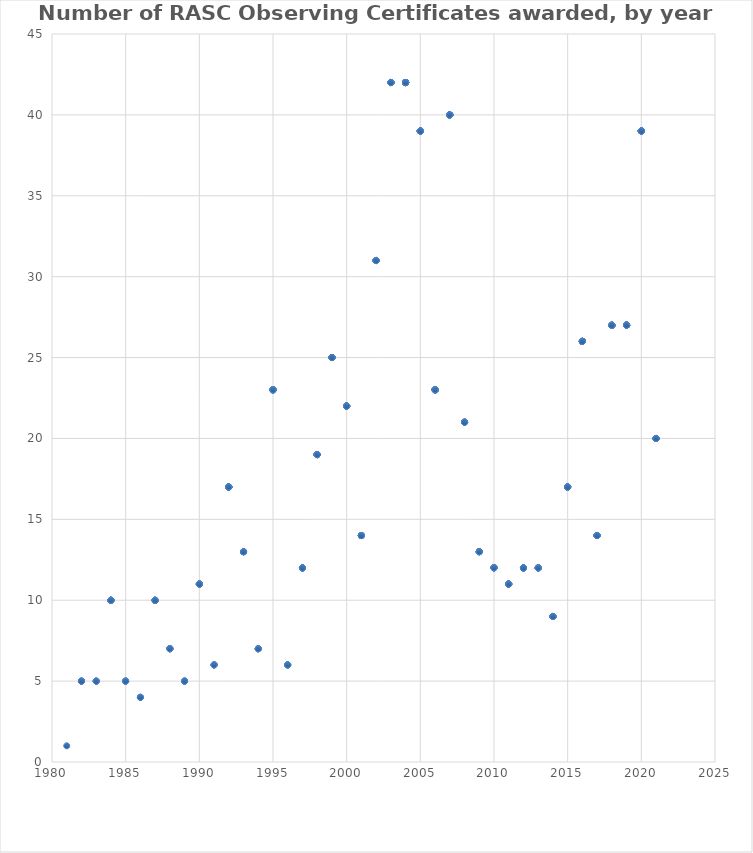
| Category | Series 0 |
|---|---|
| 2021.0 | 20 |
| 2021.0 | 20 |
| 2021.0 | 20 |
| 2021.0 | 20 |
| 2021.0 | 20 |
| 2021.0 | 20 |
| 2021.0 | 20 |
| 2021.0 | 20 |
| 2021.0 | 20 |
| 2021.0 | 20 |
| 2021.0 | 20 |
| 2021.0 | 20 |
| 2021.0 | 20 |
| 2021.0 | 20 |
| 2021.0 | 20 |
| 2021.0 | 20 |
| 2021.0 | 20 |
| 2021.0 | 20 |
| 2021.0 | 20 |
| 2021.0 | 20 |
| 2020.0 | 39 |
| 2020.0 | 39 |
| 2020.0 | 39 |
| 2020.0 | 39 |
| 2020.0 | 39 |
| 2020.0 | 39 |
| 2020.0 | 39 |
| 2020.0 | 39 |
| 2020.0 | 39 |
| 2020.0 | 39 |
| 2020.0 | 39 |
| 2020.0 | 39 |
| 2020.0 | 39 |
| 2020.0 | 39 |
| 2020.0 | 39 |
| 2020.0 | 39 |
| 2020.0 | 39 |
| 2020.0 | 39 |
| 2020.0 | 39 |
| 2020.0 | 39 |
| 2020.0 | 39 |
| 2020.0 | 39 |
| 2020.0 | 39 |
| 2020.0 | 39 |
| 2020.0 | 39 |
| 2020.0 | 39 |
| 2020.0 | 39 |
| 2020.0 | 39 |
| 2020.0 | 39 |
| 2020.0 | 39 |
| 2020.0 | 39 |
| 2020.0 | 39 |
| 2020.0 | 39 |
| 2020.0 | 39 |
| 2020.0 | 39 |
| 2020.0 | 39 |
| 2020.0 | 39 |
| 2020.0 | 39 |
| 2020.0 | 39 |
| 2019.0 | 27 |
| 2019.0 | 27 |
| 2019.0 | 27 |
| 2019.0 | 27 |
| 2019.0 | 27 |
| 2019.0 | 27 |
| 2019.0 | 27 |
| 2019.0 | 27 |
| 2019.0 | 27 |
| 2019.0 | 27 |
| 2019.0 | 27 |
| 2019.0 | 27 |
| 2019.0 | 27 |
| 2019.0 | 27 |
| 2019.0 | 27 |
| 2019.0 | 27 |
| 2019.0 | 27 |
| 2019.0 | 27 |
| 2019.0 | 27 |
| 2019.0 | 27 |
| 2019.0 | 27 |
| 2019.0 | 27 |
| 2019.0 | 27 |
| 2019.0 | 27 |
| 2019.0 | 27 |
| 2019.0 | 27 |
| 2019.0 | 27 |
| 2018.0 | 27 |
| 2018.0 | 27 |
| 2018.0 | 27 |
| 2018.0 | 27 |
| 2018.0 | 27 |
| 2018.0 | 27 |
| 2018.0 | 27 |
| 2018.0 | 27 |
| 2018.0 | 27 |
| 2018.0 | 27 |
| 2018.0 | 27 |
| 2018.0 | 27 |
| 2018.0 | 27 |
| 2018.0 | 27 |
| 2018.0 | 27 |
| 2018.0 | 27 |
| 2018.0 | 27 |
| 2018.0 | 27 |
| 2018.0 | 27 |
| 2018.0 | 27 |
| 2018.0 | 27 |
| 2018.0 | 27 |
| 2018.0 | 27 |
| 2018.0 | 27 |
| 2018.0 | 27 |
| 2018.0 | 27 |
| 2018.0 | 27 |
| 2017.0 | 14 |
| 2017.0 | 14 |
| 2017.0 | 14 |
| 2017.0 | 14 |
| 2017.0 | 14 |
| 2017.0 | 14 |
| 2017.0 | 14 |
| 2017.0 | 14 |
| 2017.0 | 14 |
| 2017.0 | 14 |
| 2017.0 | 14 |
| 2017.0 | 14 |
| 2017.0 | 14 |
| 2017.0 | 14 |
| 2016.0 | 26 |
| 2016.0 | 26 |
| 2016.0 | 26 |
| 2016.0 | 26 |
| 2016.0 | 26 |
| 2016.0 | 26 |
| 2016.0 | 26 |
| 2016.0 | 26 |
| 2016.0 | 26 |
| 2016.0 | 26 |
| 2016.0 | 26 |
| 2016.0 | 26 |
| 2016.0 | 26 |
| 2016.0 | 26 |
| 2016.0 | 26 |
| 2016.0 | 26 |
| 2016.0 | 26 |
| 2016.0 | 26 |
| 2016.0 | 26 |
| 2016.0 | 26 |
| 2016.0 | 26 |
| 2016.0 | 26 |
| 2016.0 | 26 |
| 2016.0 | 26 |
| 2016.0 | 26 |
| 2016.0 | 26 |
| 2015.0 | 17 |
| 2015.0 | 17 |
| 2015.0 | 17 |
| 2015.0 | 17 |
| 2015.0 | 17 |
| 2015.0 | 17 |
| 2015.0 | 17 |
| 2015.0 | 17 |
| 2015.0 | 17 |
| 2015.0 | 17 |
| 2015.0 | 17 |
| 2015.0 | 17 |
| 2015.0 | 17 |
| 2015.0 | 17 |
| 2015.0 | 17 |
| 2015.0 | 17 |
| 2015.0 | 17 |
| 2014.0 | 9 |
| 2014.0 | 9 |
| 2014.0 | 9 |
| 2014.0 | 9 |
| 2014.0 | 9 |
| 2014.0 | 9 |
| 2014.0 | 9 |
| 2014.0 | 9 |
| 2014.0 | 9 |
| 2013.0 | 12 |
| 2013.0 | 12 |
| 2013.0 | 12 |
| 2013.0 | 12 |
| 2013.0 | 12 |
| 2013.0 | 12 |
| 2013.0 | 12 |
| 2013.0 | 12 |
| 2013.0 | 12 |
| 2013.0 | 12 |
| 2013.0 | 12 |
| 2013.0 | 12 |
| 2012.0 | 12 |
| 2012.0 | 12 |
| 2012.0 | 12 |
| 2012.0 | 12 |
| 2012.0 | 12 |
| 2012.0 | 12 |
| 2012.0 | 12 |
| 2012.0 | 12 |
| 2012.0 | 12 |
| 2012.0 | 12 |
| 2012.0 | 12 |
| 2012.0 | 12 |
| 2011.0 | 11 |
| 2011.0 | 11 |
| 2011.0 | 11 |
| 2011.0 | 11 |
| 2011.0 | 11 |
| 2011.0 | 11 |
| 2011.0 | 11 |
| 2011.0 | 11 |
| 2011.0 | 11 |
| 2011.0 | 11 |
| 2011.0 | 11 |
| 2010.0 | 12 |
| 2010.0 | 12 |
| 2010.0 | 12 |
| 2010.0 | 12 |
| 2010.0 | 12 |
| 2010.0 | 12 |
| 2010.0 | 12 |
| 2010.0 | 12 |
| 2010.0 | 12 |
| 2010.0 | 12 |
| 2010.0 | 12 |
| 2010.0 | 12 |
| 2009.0 | 13 |
| 2009.0 | 13 |
| 2009.0 | 13 |
| 2009.0 | 13 |
| 2009.0 | 13 |
| 2009.0 | 13 |
| 2009.0 | 13 |
| 2009.0 | 13 |
| 2009.0 | 13 |
| 2009.0 | 13 |
| 2009.0 | 13 |
| 2009.0 | 13 |
| 2009.0 | 13 |
| 2008.0 | 21 |
| 2008.0 | 21 |
| 2008.0 | 21 |
| 2008.0 | 21 |
| 2008.0 | 21 |
| 2008.0 | 21 |
| 2008.0 | 21 |
| 2008.0 | 21 |
| 2008.0 | 21 |
| 2008.0 | 21 |
| 2008.0 | 21 |
| 2008.0 | 21 |
| 2008.0 | 21 |
| 2008.0 | 21 |
| 2008.0 | 21 |
| 2008.0 | 21 |
| 2008.0 | 21 |
| 2008.0 | 21 |
| 2008.0 | 21 |
| 2008.0 | 21 |
| 2008.0 | 21 |
| 2007.0 | 40 |
| 2007.0 | 40 |
| 2007.0 | 40 |
| 2007.0 | 40 |
| 2007.0 | 40 |
| 2007.0 | 40 |
| 2007.0 | 40 |
| 2007.0 | 40 |
| 2007.0 | 40 |
| 2007.0 | 40 |
| 2007.0 | 40 |
| 2007.0 | 40 |
| 2007.0 | 40 |
| 2007.0 | 40 |
| 2007.0 | 40 |
| 2007.0 | 40 |
| 2007.0 | 40 |
| 2007.0 | 40 |
| 2007.0 | 40 |
| 2007.0 | 40 |
| 2007.0 | 40 |
| 2007.0 | 40 |
| 2007.0 | 40 |
| 2007.0 | 40 |
| 2007.0 | 40 |
| 2007.0 | 40 |
| 2007.0 | 40 |
| 2007.0 | 40 |
| 2007.0 | 40 |
| 2007.0 | 40 |
| 2007.0 | 40 |
| 2007.0 | 40 |
| 2007.0 | 40 |
| 2007.0 | 40 |
| 2007.0 | 40 |
| 2007.0 | 40 |
| 2007.0 | 40 |
| 2007.0 | 40 |
| 2007.0 | 40 |
| 2007.0 | 40 |
| 2006.0 | 23 |
| 2006.0 | 23 |
| 2006.0 | 23 |
| 2006.0 | 23 |
| 2006.0 | 23 |
| 2006.0 | 23 |
| 2006.0 | 23 |
| 2006.0 | 23 |
| 2006.0 | 23 |
| 2006.0 | 23 |
| 2006.0 | 23 |
| 2006.0 | 23 |
| 2006.0 | 23 |
| 2006.0 | 23 |
| 2006.0 | 23 |
| 2006.0 | 23 |
| 2006.0 | 23 |
| 2006.0 | 23 |
| 2006.0 | 23 |
| 2006.0 | 23 |
| 2006.0 | 23 |
| 2006.0 | 23 |
| 2006.0 | 23 |
| 2005.0 | 39 |
| 2005.0 | 39 |
| 2005.0 | 39 |
| 2005.0 | 39 |
| 2005.0 | 39 |
| 2005.0 | 39 |
| 2005.0 | 39 |
| 2005.0 | 39 |
| 2005.0 | 39 |
| 2005.0 | 39 |
| 2005.0 | 39 |
| 2005.0 | 39 |
| 2005.0 | 39 |
| 2005.0 | 39 |
| 2005.0 | 39 |
| 2005.0 | 39 |
| 2005.0 | 39 |
| 2005.0 | 39 |
| 2005.0 | 39 |
| 2005.0 | 39 |
| 2005.0 | 39 |
| 2005.0 | 39 |
| 2005.0 | 39 |
| 2005.0 | 39 |
| 2005.0 | 39 |
| 2005.0 | 39 |
| 2005.0 | 39 |
| 2005.0 | 39 |
| 2005.0 | 39 |
| 2005.0 | 39 |
| 2005.0 | 39 |
| 2005.0 | 39 |
| 2005.0 | 39 |
| 2005.0 | 39 |
| 2005.0 | 39 |
| 2005.0 | 39 |
| 2005.0 | 39 |
| 2005.0 | 39 |
| 2005.0 | 39 |
| 2004.0 | 42 |
| 2004.0 | 42 |
| 2004.0 | 42 |
| 2004.0 | 42 |
| 2004.0 | 42 |
| 2004.0 | 42 |
| 2004.0 | 42 |
| 2004.0 | 42 |
| 2004.0 | 42 |
| 2004.0 | 42 |
| 2004.0 | 42 |
| 2004.0 | 42 |
| 2004.0 | 42 |
| 2004.0 | 42 |
| 2004.0 | 42 |
| 2004.0 | 42 |
| 2004.0 | 42 |
| 2004.0 | 42 |
| 2004.0 | 42 |
| 2004.0 | 42 |
| 2004.0 | 42 |
| 2004.0 | 42 |
| 2004.0 | 42 |
| 2004.0 | 42 |
| 2004.0 | 42 |
| 2004.0 | 42 |
| 2004.0 | 42 |
| 2004.0 | 42 |
| 2004.0 | 42 |
| 2004.0 | 42 |
| 2004.0 | 42 |
| 2004.0 | 42 |
| 2004.0 | 42 |
| 2004.0 | 42 |
| 2004.0 | 42 |
| 2004.0 | 42 |
| 2004.0 | 42 |
| 2004.0 | 42 |
| 2004.0 | 42 |
| 2004.0 | 42 |
| 2004.0 | 42 |
| 2004.0 | 42 |
| 2003.0 | 42 |
| 2003.0 | 42 |
| 2003.0 | 42 |
| 2003.0 | 42 |
| 2003.0 | 42 |
| 2003.0 | 42 |
| 2003.0 | 42 |
| 2003.0 | 42 |
| 2003.0 | 42 |
| 2003.0 | 42 |
| 2003.0 | 42 |
| 2003.0 | 42 |
| 2003.0 | 42 |
| 2003.0 | 42 |
| 2003.0 | 42 |
| 2003.0 | 42 |
| 2003.0 | 42 |
| 2003.0 | 42 |
| 2003.0 | 42 |
| 2003.0 | 42 |
| 2003.0 | 42 |
| 2003.0 | 42 |
| 2003.0 | 42 |
| 2003.0 | 42 |
| 2003.0 | 42 |
| 2003.0 | 42 |
| 2003.0 | 42 |
| 2003.0 | 42 |
| 2003.0 | 42 |
| 2003.0 | 42 |
| 2003.0 | 42 |
| 2003.0 | 42 |
| 2003.0 | 42 |
| 2003.0 | 42 |
| 2003.0 | 42 |
| 2003.0 | 42 |
| 2003.0 | 42 |
| 2003.0 | 42 |
| 2003.0 | 42 |
| 2003.0 | 42 |
| 2003.0 | 42 |
| 2003.0 | 42 |
| 2002.0 | 31 |
| 2002.0 | 31 |
| 2002.0 | 31 |
| 2002.0 | 31 |
| 2002.0 | 31 |
| 2002.0 | 31 |
| 2002.0 | 31 |
| 2002.0 | 31 |
| 2002.0 | 31 |
| 2002.0 | 31 |
| 2002.0 | 31 |
| 2002.0 | 31 |
| 2002.0 | 31 |
| 2002.0 | 31 |
| 2002.0 | 31 |
| 2002.0 | 31 |
| 2002.0 | 31 |
| 2002.0 | 31 |
| 2002.0 | 31 |
| 2002.0 | 31 |
| 2002.0 | 31 |
| 2002.0 | 31 |
| 2002.0 | 31 |
| 2002.0 | 31 |
| 2002.0 | 31 |
| 2002.0 | 31 |
| 2002.0 | 31 |
| 2002.0 | 31 |
| 2002.0 | 31 |
| 2002.0 | 31 |
| 2002.0 | 31 |
| 2001.0 | 14 |
| 2001.0 | 14 |
| 2001.0 | 14 |
| 2001.0 | 14 |
| 2001.0 | 14 |
| 2001.0 | 14 |
| 2001.0 | 14 |
| 2001.0 | 14 |
| 2001.0 | 14 |
| 2001.0 | 14 |
| 2001.0 | 14 |
| 2001.0 | 14 |
| 2001.0 | 14 |
| 2001.0 | 14 |
| 2000.0 | 22 |
| 2000.0 | 22 |
| 2000.0 | 22 |
| 2000.0 | 22 |
| 2000.0 | 22 |
| 2000.0 | 22 |
| 2000.0 | 22 |
| 2000.0 | 22 |
| 2000.0 | 22 |
| 2000.0 | 22 |
| 2000.0 | 22 |
| 2000.0 | 22 |
| 2000.0 | 22 |
| 2000.0 | 22 |
| 2000.0 | 22 |
| 2000.0 | 22 |
| 2000.0 | 22 |
| 2000.0 | 22 |
| 2000.0 | 22 |
| 2000.0 | 22 |
| 2000.0 | 22 |
| 2000.0 | 22 |
| 1999.0 | 25 |
| 1999.0 | 25 |
| 1999.0 | 25 |
| 1999.0 | 25 |
| 1999.0 | 25 |
| 1999.0 | 25 |
| 1999.0 | 25 |
| 1999.0 | 25 |
| 1999.0 | 25 |
| 1999.0 | 25 |
| 1999.0 | 25 |
| 1999.0 | 25 |
| 1999.0 | 25 |
| 1999.0 | 25 |
| 1999.0 | 25 |
| 1999.0 | 25 |
| 1999.0 | 25 |
| 1999.0 | 25 |
| 1999.0 | 25 |
| 1999.0 | 25 |
| 1999.0 | 25 |
| 1999.0 | 25 |
| 1999.0 | 25 |
| 1999.0 | 25 |
| 1999.0 | 25 |
| 1998.0 | 19 |
| 1998.0 | 19 |
| 1998.0 | 19 |
| 1998.0 | 19 |
| 1998.0 | 19 |
| 1998.0 | 19 |
| 1998.0 | 19 |
| 1998.0 | 19 |
| 1998.0 | 19 |
| 1998.0 | 19 |
| 1998.0 | 19 |
| 1998.0 | 19 |
| 1998.0 | 19 |
| 1998.0 | 19 |
| 1998.0 | 19 |
| 1998.0 | 19 |
| 1998.0 | 19 |
| 1998.0 | 19 |
| 1998.0 | 19 |
| 1997.0 | 12 |
| 1997.0 | 12 |
| 1997.0 | 12 |
| 1997.0 | 12 |
| 1997.0 | 12 |
| 1997.0 | 12 |
| 1997.0 | 12 |
| 1997.0 | 12 |
| 1997.0 | 12 |
| 1997.0 | 12 |
| 1997.0 | 12 |
| 1997.0 | 12 |
| 1996.0 | 6 |
| 1996.0 | 6 |
| 1996.0 | 6 |
| 1996.0 | 6 |
| 1996.0 | 6 |
| 1996.0 | 6 |
| 1995.0 | 23 |
| 1995.0 | 23 |
| 1995.0 | 23 |
| 1995.0 | 23 |
| 1995.0 | 23 |
| 1995.0 | 23 |
| 1995.0 | 23 |
| 1995.0 | 23 |
| 1995.0 | 23 |
| 1995.0 | 23 |
| 1995.0 | 23 |
| 1995.0 | 23 |
| 1995.0 | 23 |
| 1995.0 | 23 |
| 1995.0 | 23 |
| 1995.0 | 23 |
| 1995.0 | 23 |
| 1995.0 | 23 |
| 1995.0 | 23 |
| 1995.0 | 23 |
| 1995.0 | 23 |
| 1995.0 | 23 |
| 1995.0 | 23 |
| 1994.0 | 7 |
| 1994.0 | 7 |
| 1994.0 | 7 |
| 1994.0 | 7 |
| 1994.0 | 7 |
| 1994.0 | 7 |
| 1994.0 | 7 |
| 1993.0 | 13 |
| 1993.0 | 13 |
| 1993.0 | 13 |
| 1993.0 | 13 |
| 1993.0 | 13 |
| 1993.0 | 13 |
| 1993.0 | 13 |
| 1993.0 | 13 |
| 1993.0 | 13 |
| 1993.0 | 13 |
| 1993.0 | 13 |
| 1993.0 | 13 |
| 1993.0 | 13 |
| 1992.0 | 17 |
| 1992.0 | 17 |
| 1992.0 | 17 |
| 1992.0 | 17 |
| 1992.0 | 17 |
| 1992.0 | 17 |
| 1992.0 | 17 |
| 1992.0 | 17 |
| 1992.0 | 17 |
| 1992.0 | 17 |
| 1992.0 | 17 |
| 1992.0 | 17 |
| 1992.0 | 17 |
| 1992.0 | 17 |
| 1992.0 | 17 |
| 1992.0 | 17 |
| 1992.0 | 17 |
| 1991.0 | 6 |
| 1991.0 | 6 |
| 1991.0 | 6 |
| 1991.0 | 6 |
| 1991.0 | 6 |
| 1991.0 | 6 |
| 1990.0 | 11 |
| 1990.0 | 11 |
| 1990.0 | 11 |
| 1990.0 | 11 |
| 1990.0 | 11 |
| 1990.0 | 11 |
| 1990.0 | 11 |
| 1990.0 | 11 |
| 1990.0 | 11 |
| 1990.0 | 11 |
| 1990.0 | 11 |
| 1989.0 | 5 |
| 1989.0 | 5 |
| 1989.0 | 5 |
| 1989.0 | 5 |
| 1989.0 | 5 |
| 1988.0 | 7 |
| 1988.0 | 7 |
| 1988.0 | 7 |
| 1988.0 | 7 |
| 1988.0 | 7 |
| 1988.0 | 7 |
| 1988.0 | 7 |
| 1987.0 | 10 |
| 1987.0 | 10 |
| 1987.0 | 10 |
| 1987.0 | 10 |
| 1987.0 | 10 |
| 1987.0 | 10 |
| 1987.0 | 10 |
| 1987.0 | 10 |
| 1987.0 | 10 |
| 1987.0 | 10 |
| 1986.0 | 4 |
| 1986.0 | 4 |
| 1986.0 | 4 |
| 1986.0 | 4 |
| 1985.0 | 5 |
| 1985.0 | 5 |
| 1985.0 | 5 |
| 1985.0 | 5 |
| 1985.0 | 5 |
| 1984.0 | 10 |
| 1984.0 | 10 |
| 1984.0 | 10 |
| 1984.0 | 10 |
| 1984.0 | 10 |
| 1984.0 | 10 |
| 1984.0 | 10 |
| 1984.0 | 10 |
| 1984.0 | 10 |
| 1984.0 | 10 |
| 1983.0 | 5 |
| 1983.0 | 5 |
| 1983.0 | 5 |
| 1983.0 | 5 |
| 1983.0 | 5 |
| 1982.0 | 5 |
| 1982.0 | 5 |
| 1982.0 | 5 |
| 1982.0 | 5 |
| 1982.0 | 5 |
| 1981.0 | 1 |